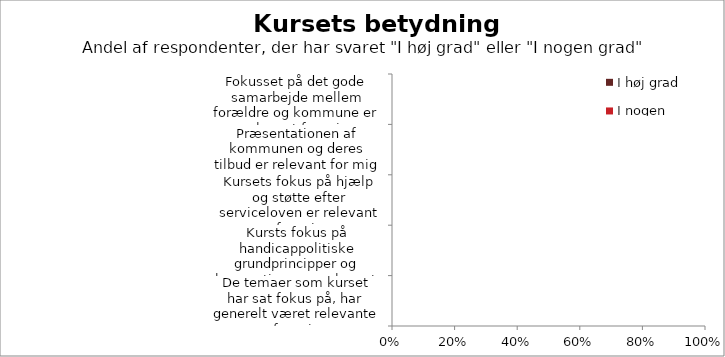
| Category | I høj grad | I nogen grad |
|---|---|---|
| De temaer som kurset har sat fokus på, har generelt været relevante for mig | 0 | 0 |
| Kursts fokus på handicappolitiske grundprincipper og konventioner er relevant for mig | 0 | 0 |
| Kursets fokus på hjælp og støtte efter serviceloven er relevant for mig | 0 | 0 |
| Præsentationen af kommunen og deres tilbud er relevant for mig | 0 | 0 |
| Fokusset på det gode samarbejde mellem forældre og kommune er relevant for mig | 0 | 0 |